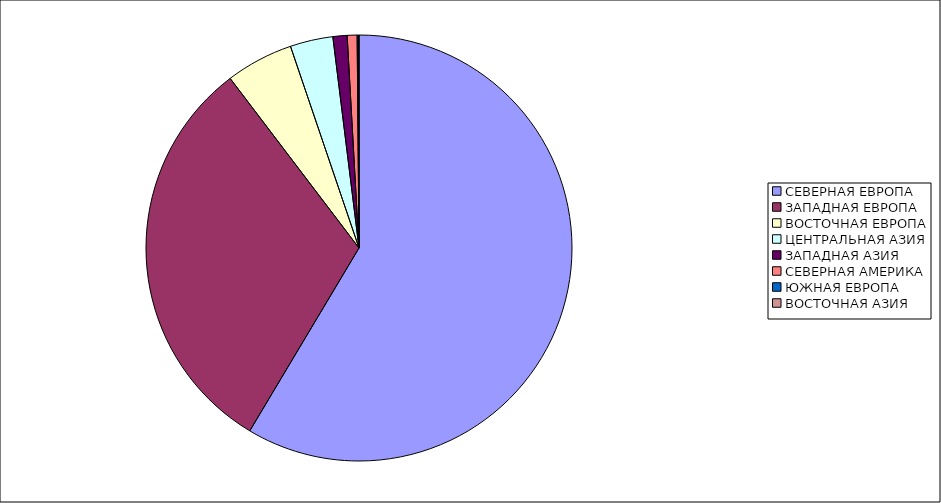
| Category | Оборот |
|---|---|
| СЕВЕРНАЯ ЕВРОПА | 58.57 |
| ЗАПАДНАЯ ЕВРОПА | 31.088 |
| ВОСТОЧНАЯ ЕВРОПА | 5.129 |
| ЦЕНТРАЛЬНАЯ АЗИЯ | 3.25 |
| ЗАПАДНАЯ АЗИЯ | 1.076 |
| СЕВЕРНАЯ АМЕРИКА | 0.749 |
| ЮЖНАЯ ЕВРОПА | 0.114 |
| ВОСТОЧНАЯ АЗИЯ | 0.025 |